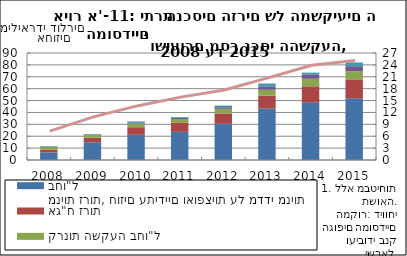
| Category | מניות זרות, חוזים עתידיים ואופציות על מדדי מניות בחו"ל | אג"ח זרות | קרנות השקעה בחו"ל | תעודות סל ונכסים זרים בארץ | אחר |
|---|---|---|---|---|---|
| 2008-12-31 | 6423.8 | 2224.9 | 2468.6 | 302.1 | 354 |
| 2009-12-31 | 14935.7 | 3750.9 | 2255.3 | 465.1 | 480.3 |
| 2010-12-31 | 21135.4 | 6432.9 | 2955.2 | 788.6 | 1204.6 |
| 2011-12-31 | 23646.4 | 7586.1 | 3244.1 | 912.6 | 634.3 |
| 2012-12-31 | 30380.8 | 8838 | 3843.4 | 1392.4 | 1332.3 |
| 2013-12-31 | 43260.3 | 10848.4 | 4920.4 | 2936.6 | 2381.8 |
| 2014-12-31 | 48509.2 | 13495.1 | 6317.2 | 3723 | 1468.8 |
| 2015-12-31 | 51889.9 | 15945.3 | 6753.1 | 4327.7 | 3129.4 |